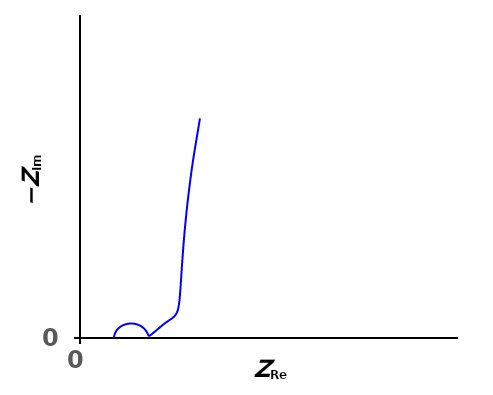
| Category | Leak1 |
|---|---|
| 9.90440214805171 | 0.019 |
| 9.90483011933715 | 0.023 |
| 9.90531711275011 | 0.029 |
| 9.90587430601844 | 0.036 |
| 9.90651656514415 | 0.045 |
| 9.90726425328489 | 0.055 |
| 9.90814605452938 | 0.069 |
| 9.90920340018484 | 0.086 |
| 9.91049742712562 | 0.107 |
| 9.91211993794566 | 0.133 |
| 9.91421068458141 | 0.167 |
| 9.91698463682528 | 0.208 |
| 9.9207749945071 | 0.261 |
| 9.92610096131054 | 0.326 |
| 9.93377430185974 | 0.408 |
| 9.94506623153912 | 0.511 |
| 9.96196712323425 | 0.64 |
| 9.98758640058495 | 0.801 |
| 10.0267576586278 | 1.001 |
| 10.0869280386233 | 1.25 |
| 10.1794010480515 | 1.555 |
| 10.3209178715239 | 1.925 |
| 10.5352981297224 | 2.364 |
| 10.8542486916822 | 2.87 |
| 11.3153744782655 | 3.423 |
| 11.9543119769356 | 3.98 |
| 12.7886407539253 | 4.473 |
| 13.7970445841289 | 4.817 |
| 14.9076284031205 | 4.936 |
| 16.0122774918868 | 4.805 |
| 17.0055585688217 | 4.459 |
| 17.8216837626555 | 3.973 |
| 18.4451892315572 | 3.433 |
| 18.8971043702756 | 2.906 |
| 19.2141580189867 | 2.431 |
| 19.4336897456843 | 2.025 |
| 19.5866812719579 | 1.69 |
| 19.6962632250818 | 1.421 |
| 19.7787106538829 | 1.211 |
| 19.8451127583207 | 1.051 |
| 19.9029250963563 | 0.933 |
| 19.9571726504626 | 0.851 |
| 20.0113061696457 | 0.798 |
| 20.067784907487 | 0.771 |
| 20.1284638880711 | 0.766 |
| 20.1948486946578 | 0.78 |
| 20.2682632574973 | 0.813 |
| 20.3499617153743 | 0.863 |
| 20.441204963504 | 0.928 |
| 20.5433153452198 | 1.01 |
| 20.6577182124299 | 1.108 |
| 20.78597601295 | 1.223 |
| 20.9298186007009 | 1.356 |
| 21.091172239486 | 1.509 |
| 21.2721890435 | 1.683 |
| 21.475276541778 | 1.879 |
| 21.7031341731431 | 2.101 |
| 21.9588199348627 | 2.352 |
| 22.2457247946955 | 2.633 |
| 22.5672562861778 | 2.949 |
| 22.927006997333 | 3.304 |
| 23.3309440894961 | 3.706 |
| 23.7904529970937 | 4.161 |
| 24.3209906245308 | 4.666 |
| 24.9322741510289 | 5.207 |
| 25.6135303426961 | 5.762 |
| 26.3253519053979 | 6.32 |
| 27.0090246009339 | 6.903 |
| 27.6101727861151 | 7.577 |
| 28.0993660589369 | 8.44 |
| 28.4765979320465 | 9.604 |
| 28.7626893526748 | 11.188 |
| 28.9883223326566 | 13.313 |
| 29.1875308487268 | 16.117 |
| 29.396763662627 | 19.762 |
| 29.6583317583771 | 24.448 |
| 30.0273848138623 | 30.425 |
| 30.5827432409197 | 38.008 |
| 31.4431805968699 | 47.589 |
| 32.7920738360084 | 59.654 |
| 34.9148755543968 | 74.798 |